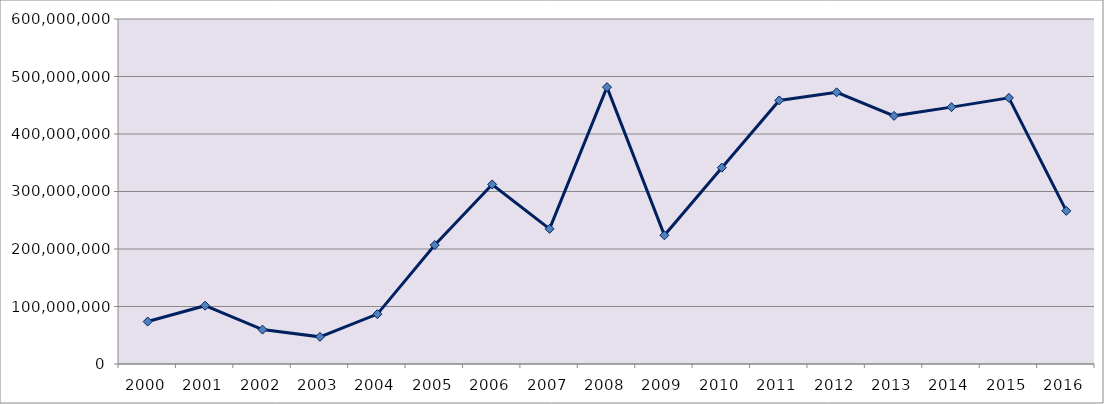
| Category | Valores em US$/FOB |
|---|---|
| 2000.0 | 73855709 |
| 2001.0 | 101422771 |
| 2002.0 | 59863312 |
| 2003.0 | 47223002 |
| 2004.0 | 86753028 |
| 2005.0 | 206850043 |
| 2006.0 | 312229027 |
| 2007.0 | 235060310 |
| 2008.0 | 481484383 |
| 2009.0 | 223843402 |
| 2010.0 | 341454407 |
| 2011.0 | 458391195 |
| 2012.0 | 472464095 |
| 2013.0 | 431553432 |
| 2014.0 | 446710095 |
| 2015.0 | 462860033 |
| 2016.0 | 266396183 |